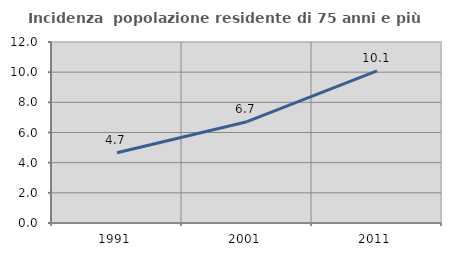
| Category | Incidenza  popolazione residente di 75 anni e più |
|---|---|
| 1991.0 | 4.66 |
| 2001.0 | 6.715 |
| 2011.0 | 10.085 |